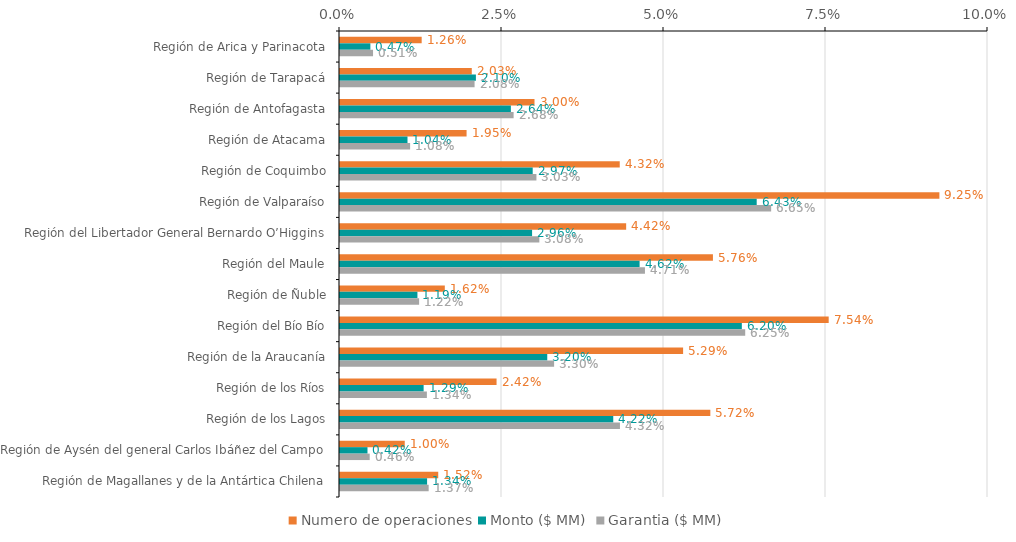
| Category | Numero de operaciones | Monto ($ MM) | Garantia ($ MM) |
|---|---|---|---|
| Región de Arica y Parinacota | 0.013 | 0.005 | 0.005 |
| Región de Tarapacá | 0.02 | 0.021 | 0.021 |
| Región de Antofagasta | 0.03 | 0.026 | 0.027 |
| Región de Atacama | 0.02 | 0.01 | 0.011 |
| Región de Coquimbo | 0.043 | 0.03 | 0.03 |
| Región de Valparaíso | 0.092 | 0.064 | 0.067 |
| Región del Libertador General Bernardo O’Higgins | 0.044 | 0.03 | 0.031 |
| Región del Maule | 0.058 | 0.046 | 0.047 |
| Región de Ñuble | 0.016 | 0.012 | 0.012 |
| Región del Bío Bío | 0.075 | 0.062 | 0.063 |
| Región de la Araucanía | 0.053 | 0.032 | 0.033 |
| Región de los Ríos | 0.024 | 0.013 | 0.013 |
| Región de los Lagos | 0.057 | 0.042 | 0.043 |
| Región de Aysén del general Carlos Ibáñez del Campo | 0.01 | 0.004 | 0.005 |
| Región de Magallanes y de la Antártica Chilena | 0.015 | 0.013 | 0.014 |